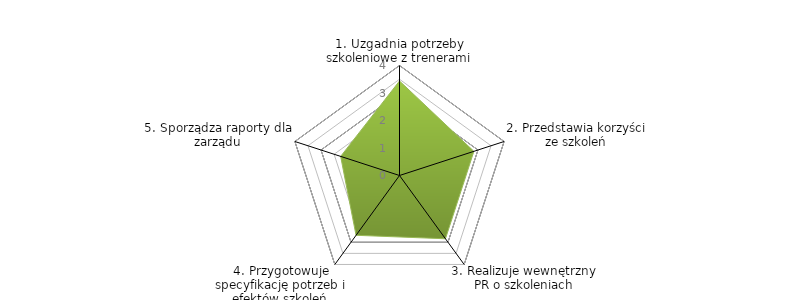
| Category | Series 0 | BENCHMARK |
|---|---|---|
| 1. Uzgadnia potrzeby szkoleniowe z trenerami |  | 3.438 |
| 2. Przedstawia korzyści ze szkoleń |  | 2.844 |
| 3. Realizuje wewnętrzny PR o szkoleniach |  | 2.844 |
| 4. Przygotowuje specyfikację potrzeb i efektów szkoleń |  | 2.688 |
| 5. Sporządza raporty dla zarządu |  | 2.25 |